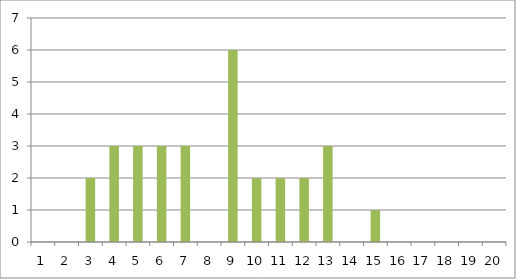
| Category | Series 0 |
|---|---|
| 0 | 0 |
| 1 | 0 |
| 2 | 2 |
| 3 | 3 |
| 4 | 3 |
| 5 | 3 |
| 6 | 3 |
| 7 | 0 |
| 8 | 6 |
| 9 | 2 |
| 10 | 2 |
| 11 | 2 |
| 12 | 3 |
| 13 | 0 |
| 14 | 1 |
| 15 | 0 |
| 16 | 0 |
| 17 | 0 |
| 18 | 0 |
| 19 | 0 |